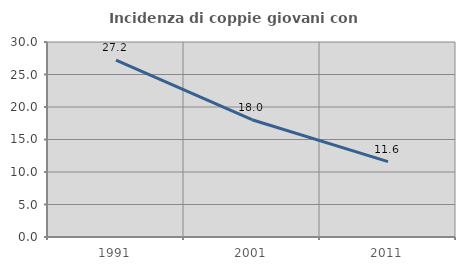
| Category | Incidenza di coppie giovani con figli |
|---|---|
| 1991.0 | 27.225 |
| 2001.0 | 18.047 |
| 2011.0 | 11.594 |